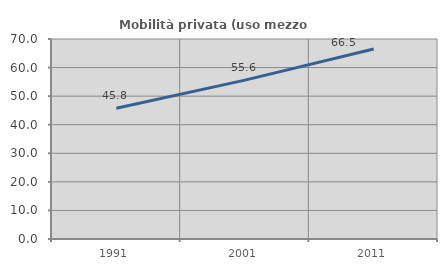
| Category | Mobilità privata (uso mezzo privato) |
|---|---|
| 1991.0 | 45.757 |
| 2001.0 | 55.605 |
| 2011.0 | 66.473 |